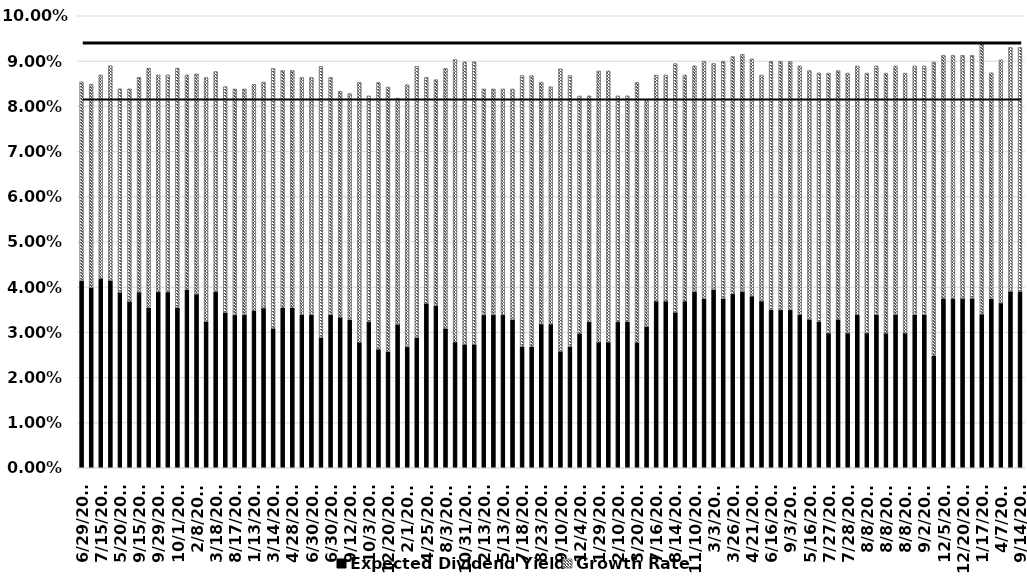
| Category | Expected Dividend Yield | Growth Rate |
|---|---|---|
| 6/29/12 | 0.041 | 0.044 |
| 4/3/13 | 0.04 | 0.045 |
| 7/15/13 | 0.042 | 0.045 |
| 3/10/14 | 0.041 | 0.048 |
| 5/20/14 | 0.039 | 0.045 |
| 5/11/15 | 0.037 | 0.047 |
| 9/15/15 | 0.039 | 0.048 |
| 9/15/15 | 0.035 | 0.053 |
| 9/29/15 | 0.039 | 0.048 |
| 10/1/15 | 0.039 | 0.048 |
| 10/1/15 | 0.035 | 0.053 |
| 11/6/15 | 0.039 | 0.048 |
| 2/8/16 | 0.038 | 0.049 |
| 2/8/16 | 0.032 | 0.054 |
| 3/18/16 | 0.039 | 0.049 |
| 8/2/16 | 0.034 | 0.05 |
| 8/17/16 | 0.034 | 0.05 |
| 9/7/16 | 0.034 | 0.05 |
| 1/13/17 | 0.035 | 0.05 |
| 3/3/17 | 0.035 | 0.05 |
| 3/14/17 | 0.031 | 0.058 |
| 4/5/17 | 0.035 | 0.052 |
| 4/28/17 | 0.035 | 0.052 |
| 6/9/17 | 0.034 | 0.052 |
| 6/30/17 | 0.034 | 0.052 |
| 6/30/17 | 0.029 | 0.06 |
| 6/30/17 | 0.034 | 0.052 |
| 7/26/17 | 0.033 | 0.05 |
| 9/12/17 | 0.033 | 0.05 |
| 9/12/17 | 0.028 | 0.058 |
| 10/3/17 | 0.032 | 0.05 |
| 11/30/17 | 0.026 | 0.059 |
| 12/20/17 | 0.026 | 0.058 |
| 1/23/18 | 0.032 | 0.05 |
| 2/1/18 | 0.027 | 0.058 |
| 3/22/18 | 0.029 | 0.06 |
| 4/25/18 | 0.036 | 0.05 |
| 5/14/18 | 0.036 | 0.05 |
| 8/3/18 | 0.031 | 0.058 |
| 10/26/18 | 0.028 | 0.062 |
| 10/31/18 | 0.027 | 0.062 |
| 1/14/19 | 0.027 | 0.062 |
| 2/13/19 | 0.034 | 0.05 |
| 3/22/19 | 0.034 | 0.05 |
| 5/13/19 | 0.034 | 0.05 |
| 6/6/19 | 0.033 | 0.051 |
| 7/18/19 | 0.027 | 0.06 |
| 7/19/19 | 0.027 | 0.06 |
| 8/23/19 | 0.032 | 0.054 |
| 9/10/19 | 0.032 | 0.052 |
| 9/10/19 | 0.026 | 0.062 |
| 10/31/19 | 0.027 | 0.06 |
| 12/4/19 | 0.03 | 0.052 |
| 12/20/19 | 0.032 | 0.05 |
| 1/29/20 | 0.028 | 0.06 |
| 2/7/20 | 0.028 | 0.06 |
| 2/10/20 | 0.032 | 0.05 |
| 2/21/20 | 0.032 | 0.05 |
| 3/20/20 | 0.028 | 0.058 |
| 4/13/20 | 0.031 | 0.05 |
| 7/16/20 | 0.037 | 0.05 |
| 8/14/20 | 0.037 | 0.05 |
| 8/14/20 | 0.034 | 0.055 |
| 8/20/20 | 0.037 | 0.05 |
| 11/10/20 | 0.039 | 0.05 |
| 11/19/20 | 0.037 | 0.052 |
| 3/3/21 | 0.039 | 0.05 |
| 3/18/21 | 0.037 | 0.052 |
| 3/26/21 | 0.038 | 0.052 |
| 3/31/21 | 0.039 | 0.052 |
| 4/21/21 | 0.038 | 0.052 |
| 4/21/21 | 0.037 | 0.05 |
| 6/16/21 | 0.035 | 0.055 |
| 8/13/21 | 0.035 | 0.055 |
| 9/3/21 | 0.035 | 0.055 |
| 4/1/22 | 0.034 | 0.055 |
| 5/16/22 | 0.033 | 0.055 |
| 6/14/22 | 0.032 | 0.055 |
| 7/27/22 | 0.03 | 0.058 |
| 7/28/22 | 0.033 | 0.055 |
| 7/28/22 | 0.03 | 0.058 |
| 8/8/22 | 0.034 | 0.055 |
| 8/8/22 | 0.03 | 0.058 |
| 8/8/22 | 0.034 | 0.055 |
| 8/8/22 | 0.03 | 0.058 |
| 8/8/22 | 0.034 | 0.055 |
| 8/8/22 | 0.03 | 0.058 |
| 8/26/22 | 0.034 | 0.055 |
| 9/2/22 | 0.034 | 0.055 |
| 10/25/22 | 0.025 | 0.065 |
| 12/5/22 | 0.037 | 0.054 |
| 12/11/22 | 0.037 | 0.054 |
| 12/20/22 | 0.037 | 0.054 |
| 12/22/22 | 0.037 | 0.054 |
| 1/17/23 | 0.034 | 0.06 |
| 3/7/23 | 0.037 | 0.05 |
| 4/7/23 | 0.036 | 0.054 |
| 8/29/23 | 0.039 | 0.054 |
| 9/14/23 | 0.039 | 0.054 |